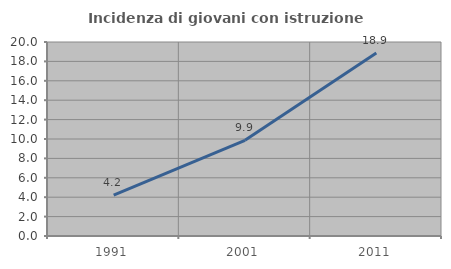
| Category | Incidenza di giovani con istruzione universitaria |
|---|---|
| 1991.0 | 4.205 |
| 2001.0 | 9.868 |
| 2011.0 | 18.859 |